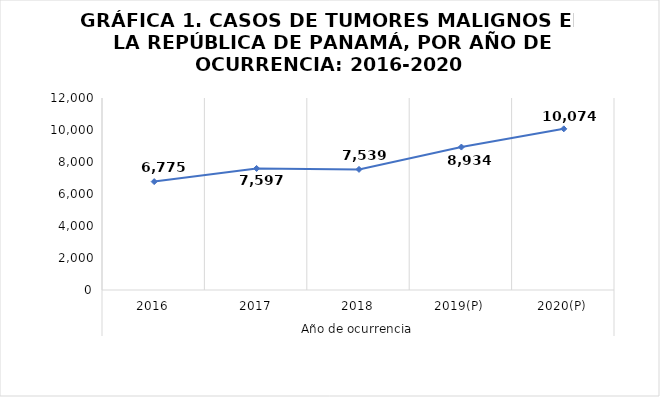
| Category | Total |
|---|---|
| 0 | 6775 |
| 1 | 7597 |
| 2 | 7539 |
| 3 | 8934 |
| 4 | 10074 |